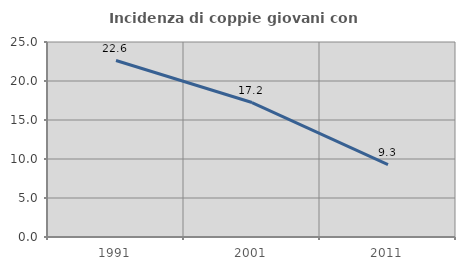
| Category | Incidenza di coppie giovani con figli |
|---|---|
| 1991.0 | 22.624 |
| 2001.0 | 17.241 |
| 2011.0 | 9.281 |